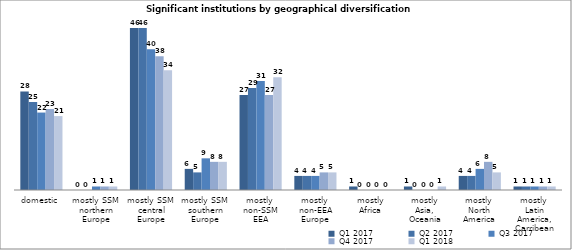
| Category | Q1 2017 | Q2 2017 | Q3 2017 | Q4 2017 | Q1 2018 |
|---|---|---|---|---|---|
| domestic | 28 | 25 | 22 | 23 | 21 |
| mostly SSM 
northern Europe | 0 | 0 | 1 | 1 | 1 |
| mostly SSM 
central Europe | 46 | 46 | 40 | 38 | 34 |
| mostly SSM 
southern Europe | 6 | 5 | 9 | 8 | 8 |
| mostly 
non-SSM EEA | 27 | 29 | 31 | 27 | 32 |
| mostly 
non-EEA Europe | 4 | 4 | 4 | 5 | 5 |
| mostly
Africa | 1 | 0 | 0 | 0 | 0 |
| mostly 
Asia, 
Oceania | 1 | 0 | 0 | 0 | 1 |
| mostly 
North America | 4 | 4 | 6 | 8 | 5 |
| mostly 
Latin America,
Carribean | 1 | 1 | 1 | 1 | 1 |